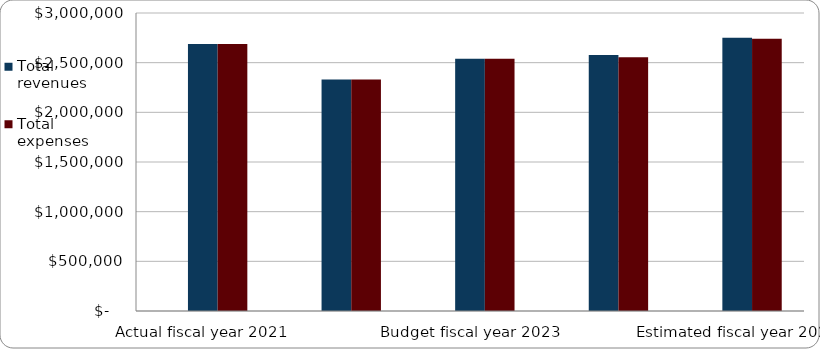
| Category | Series 1 | Total revenues | Total expenses |
|---|---|---|---|
| Actual fiscal year 2021 |  | 2687158 | 2687158 |
| Actual (estimated) fiscal year 2022 |  | 2331575 | 2331575 |
| Budget fiscal year 2023 |  | 2540344 | 2540344 |
| Estimated fiscal year 2024 |  | 2576582.952 | 2554042.189 |
| Estimated fiscal year 2025 |  | 2749756.117 | 2739794.022 |